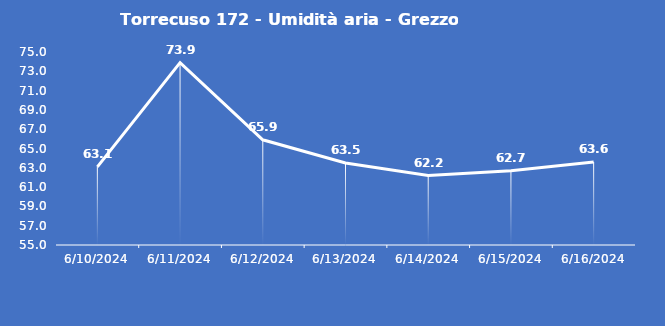
| Category | Torrecuso 172 - Umidità aria - Grezzo (%) |
|---|---|
| 6/10/24 | 63.1 |
| 6/11/24 | 73.9 |
| 6/12/24 | 65.9 |
| 6/13/24 | 63.5 |
| 6/14/24 | 62.2 |
| 6/15/24 | 62.7 |
| 6/16/24 | 63.6 |